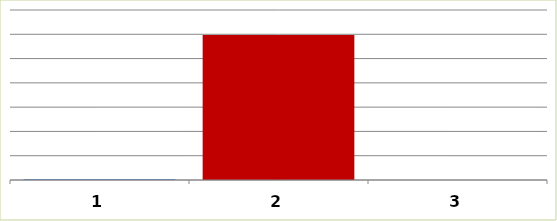
| Category | Series 0 |
|---|---|
| 0 | 21600 |
| 1 | 2986530 |
| 2 | 0 |